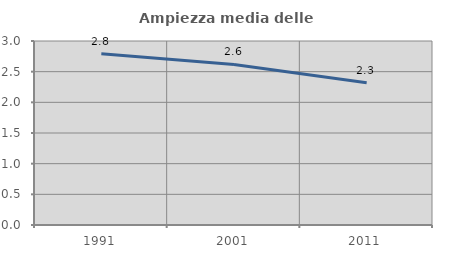
| Category | Ampiezza media delle famiglie |
|---|---|
| 1991.0 | 2.793 |
| 2001.0 | 2.617 |
| 2011.0 | 2.319 |